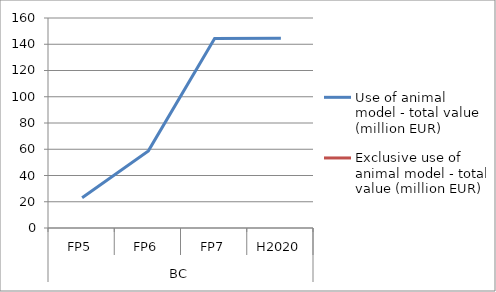
| Category | Use of animal model - total value (million EUR)   | Exclusive use of animal model - total value (million EUR) |
|---|---|---|
| 0 | 22.983 | 0 |
| 1 | 58.777 | 0 |
| 2 | 144.458 | 0 |
| 3 | 144.501 | 0 |